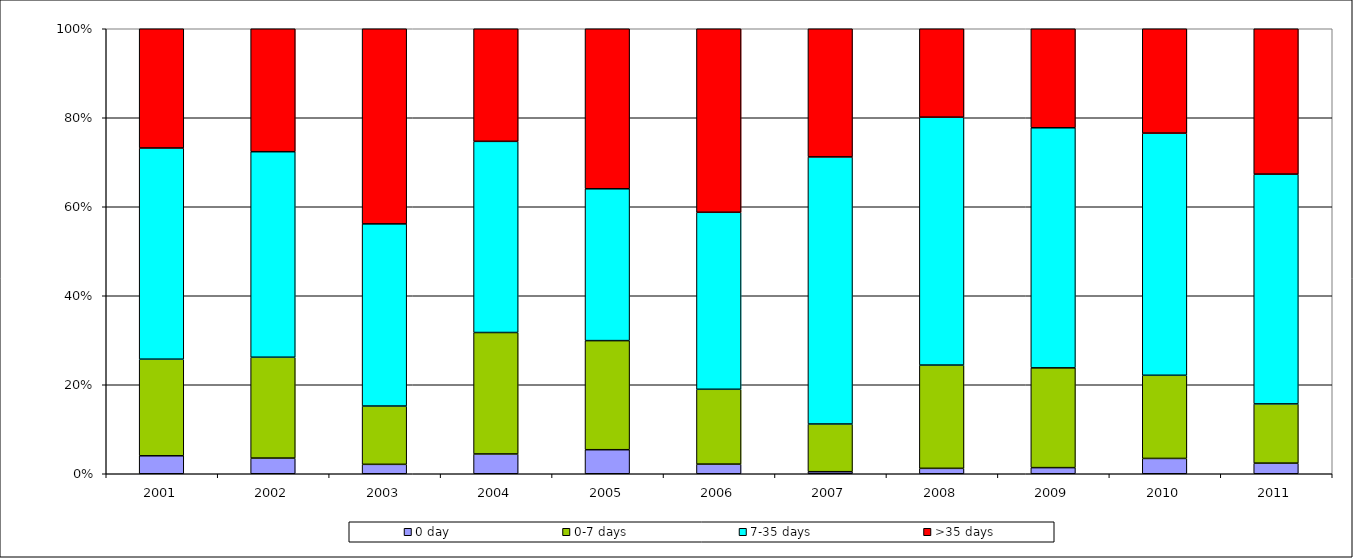
| Category | 0 day | 0-7 days | 7-35 days | >35 days |
|---|---|---|---|---|
| 2001.0 | 4.04 | 21.706 | 47.458 | 26.796 |
| 2002.0 | 3.524 | 22.662 | 46.182 | 27.632 |
| 2003.0 | 2.114 | 13.102 | 40.939 | 43.846 |
| 2004.0 | 4.446 | 27.295 | 42.954 | 25.304 |
| 2005.0 | 5.402 | 24.517 | 34.119 | 35.962 |
| 2006.0 | 2.167 | 16.818 | 39.776 | 41.24 |
| 2007.0 | 0.458 | 10.725 | 60.018 | 28.799 |
| 2008.0 | 1.216 | 23.206 | 55.707 | 19.871 |
| 2009.0 | 1.374 | 22.425 | 53.95 | 22.251 |
| 2010.0 | 3.443 | 18.685 | 54.41 | 23.461 |
| 2011.0 | 2.388 | 13.307 | 51.638 | 32.667 |